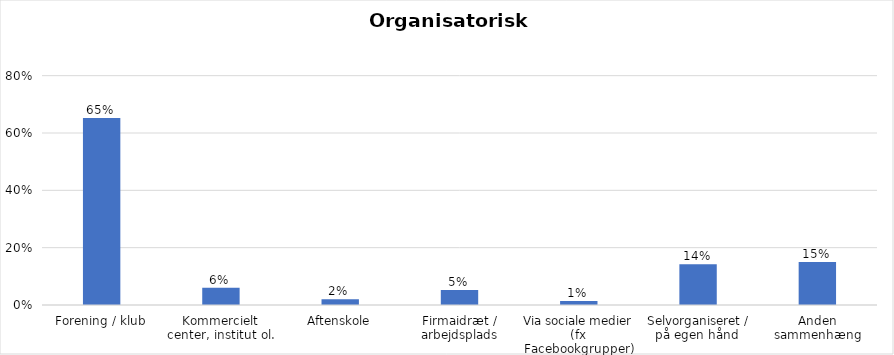
| Category | % |
|---|---|
| Forening / klub | 0.653 |
| Kommercielt center, institut ol. | 0.06 |
| Aftenskole | 0.02 |
| Firmaidræt / arbejdsplads | 0.052 |
| Via sociale medier (fx Facebookgrupper) | 0.014 |
| Selvorganiseret / på egen hånd  | 0.142 |
| Anden sammenhæng | 0.15 |